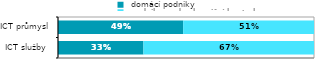
| Category |  domácí podniky |  podniky pod zahraniční kontrolou |
|---|---|---|
| ICT služby  | 0.334 | 0.666 |
| ICT průmysl | 0.489 | 0.511 |